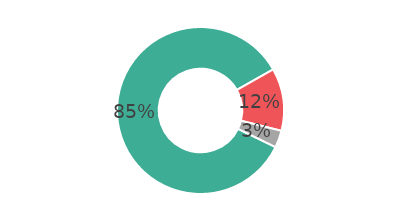
| Category | Series 0 |
|---|---|
| Incontournable aujourd'hui | 84.588 |
| Pas prioritaire, ce n'est pas mon cour de métier | 12.112 |
| Autre : | 3.301 |